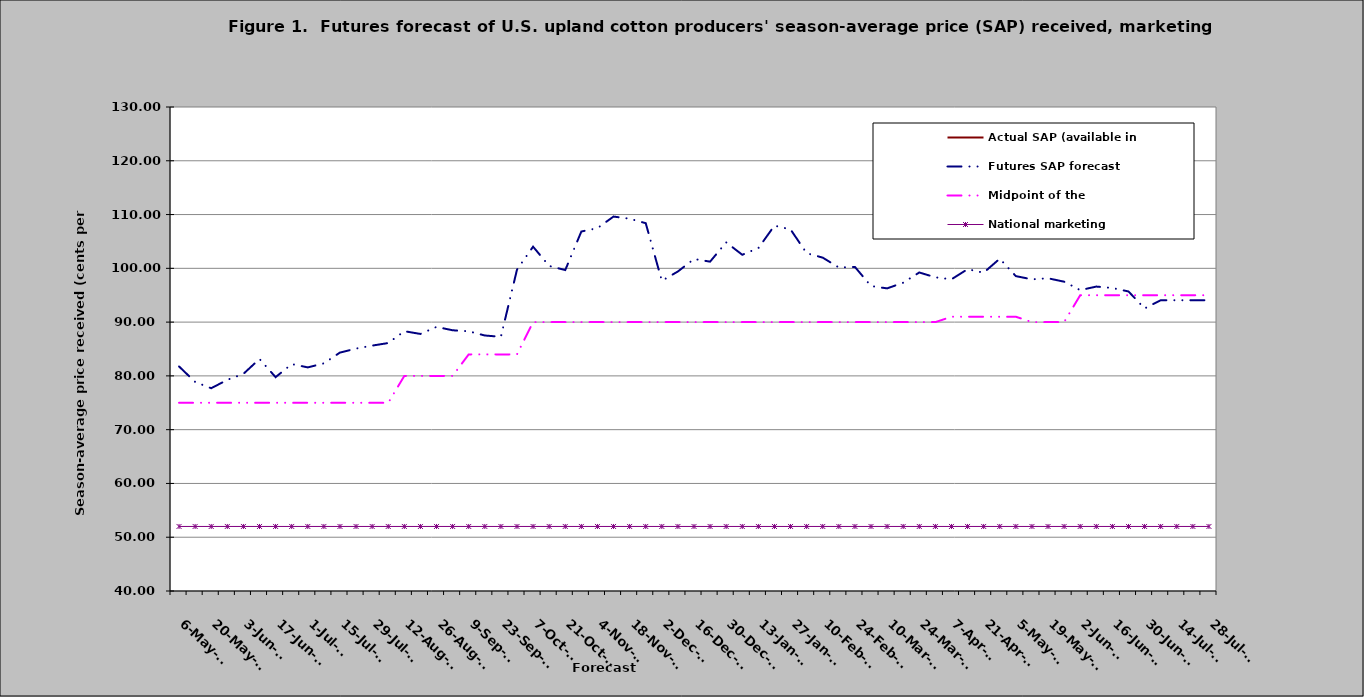
| Category | Actual SAP (available in | Futures SAP forecast | Midpoint of the | National marketing |
|---|---|---|---|---|
| 2021-05-06 |  | 81.751 | 75 | 52 |
| 2021-05-13 |  | 78.872 | 75 | 52 |
| 2021-05-20 |  | 77.708 | 75 | 52 |
| 2021-05-27 |  | 79.262 | 75 | 52 |
| 2021-06-03 |  | 80.38 | 75 | 52 |
| 2021-06-10 |  | 83.146 | 75 | 52 |
| 2021-06-17 |  | 79.764 | 75 | 52 |
| 2021-06-24 |  | 82.204 | 75 | 52 |
| 2021-07-01 |  | 81.58 | 75 | 52 |
| 2021-07-08 |  | 82.334 | 75 | 52 |
| 2021-07-15 |  | 84.336 | 75 | 52 |
| 2021-07-22 |  | 85.079 | 75 | 52 |
| 2021-07-29 |  | 85.632 | 75 | 52 |
| 2021-08-05 |  | 86.107 | 75 | 52 |
| 2021-08-12 |  | 88.311 | 80 | 52 |
| 2021-08-19 |  | 87.798 | 80 | 52 |
| 2021-08-26 |  | 89.107 | 80 | 52 |
| 2021-09-02 |  | 88.484 | 80 | 52 |
| 2021-09-09 |  | 88.297 | 84 | 52 |
| 2021-09-16 |  | 87.513 | 84 | 52 |
| 2021-09-23 |  | 87.266 | 84 | 52 |
| 2021-09-30 |  | 99.746 | 84 | 52 |
| 2021-10-07 |  | 104.026 | 90 | 52 |
| 2021-10-14 |  | 100.444 | 90 | 52 |
| 2021-10-21 |  | 99.68 | 90 | 52 |
| 2021-10-28 |  | 106.843 | 90 | 52 |
| 2021-11-04 |  | 107.48 | 90 | 52 |
| 2021-11-11 |  | 109.627 | 90 | 52 |
| 2021-11-18 |  | 109.225 | 90 | 52 |
| 2021-11-25 |  | 108.397 | 90 | 52 |
| 2021-12-02 |  | 97.687 | 90 | 52 |
| 2021-12-09 |  | 99.415 | 90 | 52 |
| 2021-12-16 |  | 101.734 | 90 | 52 |
| 2021-12-23 |  | 101.242 | 90 | 52 |
| 2021-12-30 |  | 104.83 | 90 | 52 |
| 2022-01-06 |  | 102.519 | 90 | 52 |
| 2022-01-13 |  | 103.763 | 90 | 52 |
| 2022-01-20 |  | 107.944 | 90 | 52 |
| 2022-01-27 |  | 107.23 | 90 | 52 |
| 2022-02-03 |  | 102.816 | 90 | 52 |
| 2022-02-10 |  | 101.987 | 90 | 52 |
| 2022-02-17 |  | 100.157 | 90 | 52 |
| 2022-02-24 |  | 100.258 | 90 | 52 |
| 2022-03-03 |  | 96.708 | 90 | 52 |
| 2022-03-10 |  | 96.272 | 90 | 52 |
| 2022-03-17 |  | 97.323 | 90 | 52 |
| 2022-03-24 |  | 99.231 | 90 | 52 |
| 2022-03-31 |  | 98.319 | 90 | 52 |
| 2022-04-07 |  | 97.961 | 91 | 52 |
| 2022-04-14 |  | 99.844 | 91 | 52 |
| 2022-04-21 |  | 99.186 | 91 | 52 |
| 2022-04-28 |  | 101.794 | 91 | 52 |
| 2022-05-05 |  | 98.549 | 91 | 52 |
| 2022-05-12 |  | 97.956 | 90 | 52 |
| 2022-05-19 |  | 98.149 | 90 | 52 |
| 2022-05-26 |  | 97.516 | 90 | 52 |
| 2022-06-02 |  | 95.948 | 95 | 52 |
| 2022-06-09 |  | 96.609 | 95 | 52 |
| 2022-06-16 |  | 96.343 | 95 | 52 |
| 2022-06-23 |  | 95.699 | 95 | 52 |
| 2022-06-30 |  | 92.541 | 95 | 52 |
| 2022-07-07 |  | 94.07 | 95 | 52 |
| 2022-07-14 |  | 94.07 | 95 | 52 |
| 2022-07-21 |  | 94.07 | 95 | 52 |
| 2022-07-28 |  | 94.07 | 95 | 52 |